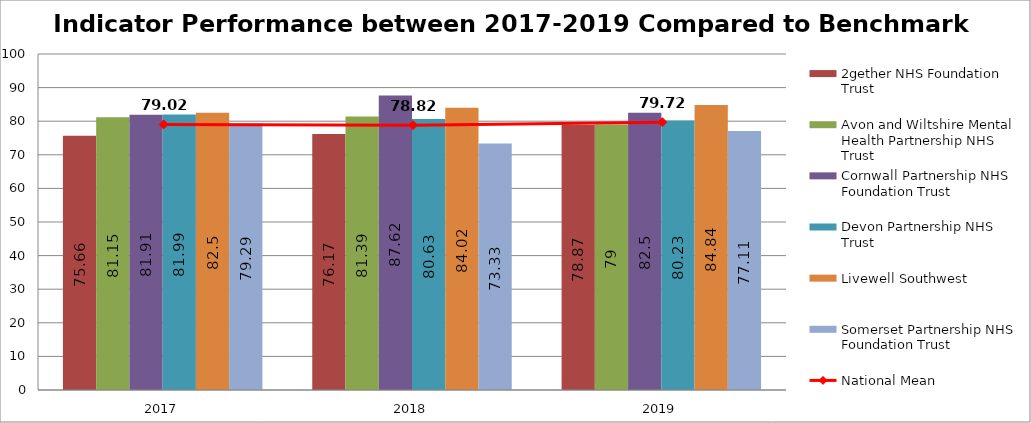
| Category | 2gether NHS Foundation Trust | Avon and Wiltshire Mental Health Partnership NHS Trust | Cornwall Partnership NHS Foundation Trust | Devon Partnership NHS Trust | Livewell Southwest | Somerset Partnership NHS Foundation Trust |
|---|---|---|---|---|---|---|
| 2017 | 75.66 | 81.15 | 81.91 | 81.99 | 82.5 | 79.29 |
| 2018 | 76.17 | 81.39 | 87.62 | 80.63 | 84.02 | 73.33 |
| 2019 | 78.87 | 79 | 82.5 | 80.23 | 84.84 | 77.11 |